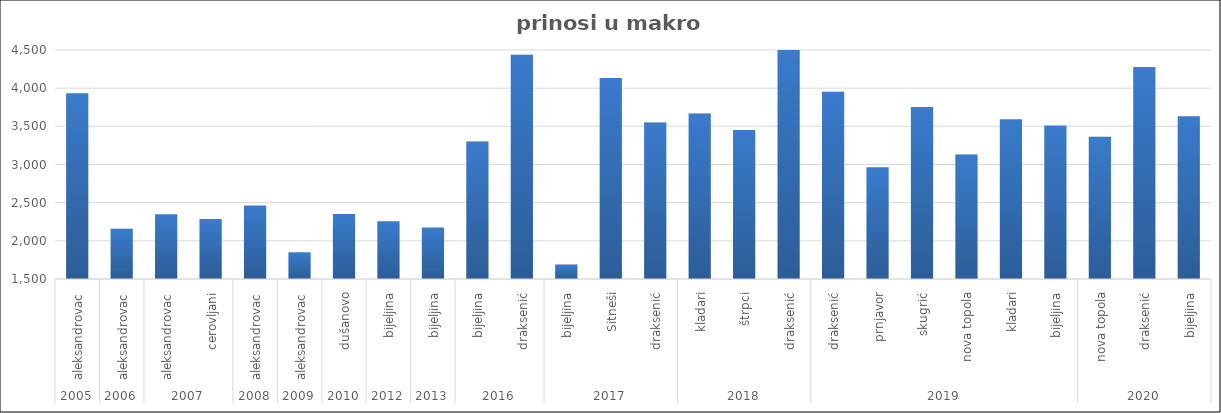
| Category | Series 0 |
|---|---|
| 0 | 3933.625 |
| 1 | 2159.792 |
| 2 | 2347.117 |
| 3 | 2284.533 |
| 4 | 2463.285 |
| 5 | 1850.476 |
| 6 | 2350.762 |
| 7 | 2258.182 |
| 8 | 2175.565 |
| 9 | 3299.917 |
| 10 | 4439.25 |
| 11 | 1689.5 |
| 12 | 4133.125 |
| 13 | 3549.625 |
| 14 | 3667 |
| 15 | 3451 |
| 16 | 4607 |
| 17 | 3954 |
| 18 | 2963 |
| 19 | 3754 |
| 20 | 3130 |
| 21 | 3592 |
| 22 | 3512 |
| 23 | 3363 |
| 24 | 4276 |
| 25 | 3631 |